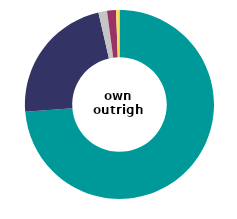
| Category | own
outright |
|---|---|
| very 
satisfied | 73.768 |
| fairly
satisfied | 22.649 |
| neither satisfied 
nor dissatisfied | 1.466 |
| slightly 
dissatisfied | 1.532 |
| very
 dissatisfied | 0.586 |